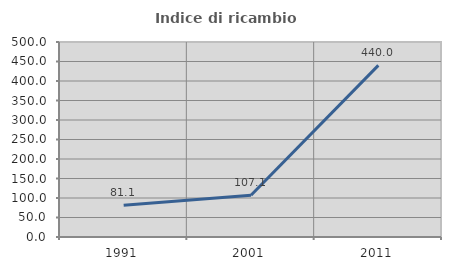
| Category | Indice di ricambio occupazionale  |
|---|---|
| 1991.0 | 81.102 |
| 2001.0 | 107.087 |
| 2011.0 | 440 |